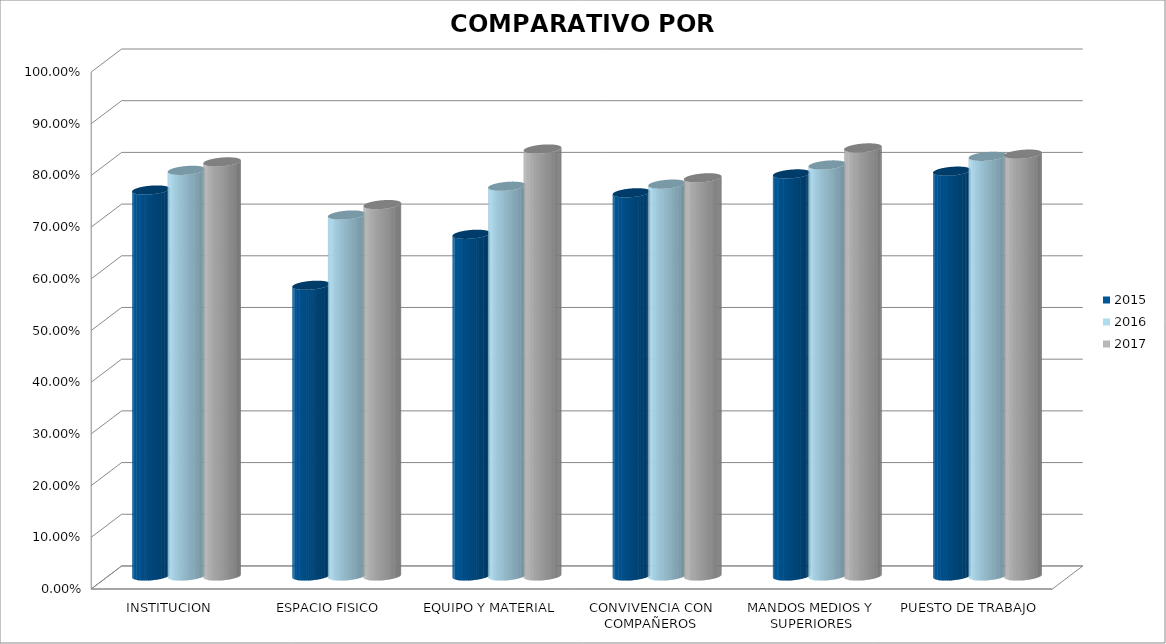
| Category | 2015 | 2016 | 2017 |
|---|---|---|---|
| INSTITUCION | 0.747 | 0.785 | 0.801 |
| ESPACIO FISICO | 0.562 | 0.698 | 0.718 |
| EQUIPO Y MATERIAL | 0.661 | 0.754 | 0.826 |
| CONVIVENCIA CON COMPAÑEROS | 0.741 | 0.758 | 0.77 |
| MANDOS MEDIOS Y SUPERIORES | 0.778 | 0.795 | 0.828 |
| PUESTO DE TRABAJO | 0.783 | 0.812 | 0.816 |